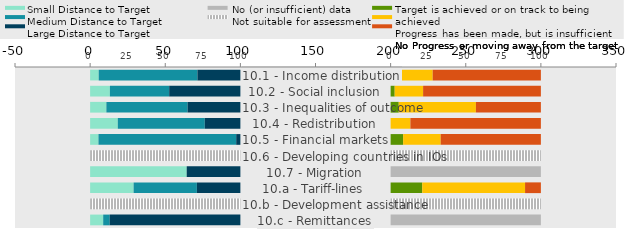
| Category | No (or insufficient) data | Not suitable for assessment | Small Distance to Target | Medium Distance to Target | Large Distance to Target | GAP | Target is achieved or on track to being achieved | Progress has been made, but is insufficient to meet the target | No progress or moving away from the SDG target |
|---|---|---|---|---|---|---|---|---|---|
| 10.1 - Income distribution | 0 | 0 | 5.714 | 65.714 | 28.571 | 100 | 0 | 28 | 72 |
| 10.2 - Social inclusion | 0 | 0 | 13.158 | 39.474 | 47.368 | 100 | 2.703 | 18.919 | 78.378 |
| 10.3 - Inequalities of outcome | 0 | 0 | 10.811 | 54.054 | 35.135 | 100 | 5.405 | 51.351 | 43.243 |
| 10.4 - Redistribution | 0 | 0 | 18.421 | 57.895 | 23.684 | 100 | 0 | 13.158 | 86.842 |
| 10.5 - Financial markets | 0 | 0 | 5.556 | 91.667 | 2.778 | 100 | 8.333 | 25 | 66.667 |
| 10.6 - Developing countries in IOs | 0 | 100 | 0 | 0 | 0 | 100 | 0 | 0 | 0 |
| 10.7 - Migration | 100 | 0 | 64.286 | 0 | 35.714 | 100 | 0 | 0 | 0 |
| 10.a - Tariff-lines | 0 | 0 | 28.947 | 42.105 | 28.947 | 100 | 21.053 | 68.421 | 10.526 |
| 10.b - Development assistance | 0 | 100 | 0 | 0 | 0 | 100 | 0 | 0 | 0 |
| 10.c - Remittances | 100 | 0 | 8.696 | 4.348 | 86.957 | 100 | 0 | 0 | 0 |